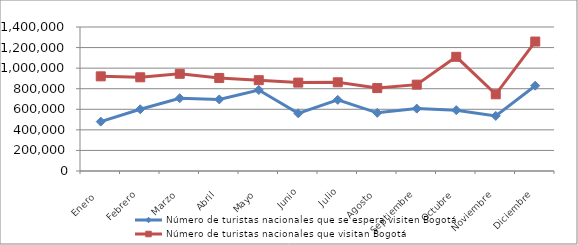
| Category | Número de turistas nacionales que se espera visiten Bogotá | Número de turistas nacionales que visitan Bogotá |
|---|---|---|
| Enero  | 479958.75 | 920176.667 |
| Febrero | 600228.5 | 910893 |
| Marzo | 707607.5 | 945052 |
| Abril | 695760 | 904585 |
| Mayo | 787707.75 | 883042 |
| Junio | 560637.75 | 859410 |
| Julio | 691565.5 | 862337 |
| Agosto | 565531.75 | 806120 |
| Septiembre | 606499.5 | 839449 |
| Octubre | 591549.5 | 1110187 |
| Noviembre | 535562.5 | 745619 |
| Diciembre | 829346.75 | 1258567 |